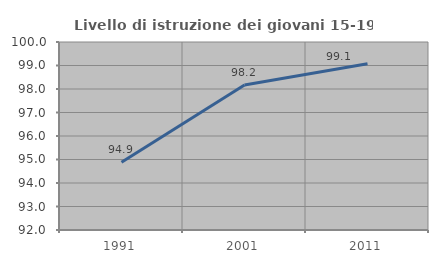
| Category | Livello di istruzione dei giovani 15-19 anni |
|---|---|
| 1991.0 | 94.885 |
| 2001.0 | 98.168 |
| 2011.0 | 99.074 |